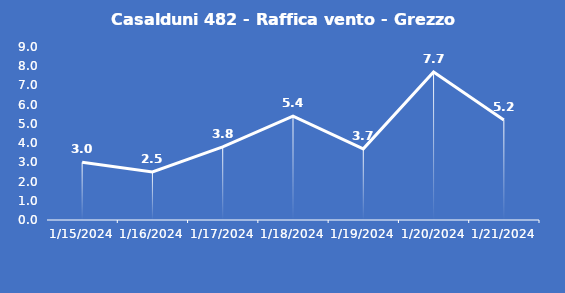
| Category | Casalduni 482 - Raffica vento - Grezzo (m/s) |
|---|---|
| 1/15/24 | 3 |
| 1/16/24 | 2.5 |
| 1/17/24 | 3.8 |
| 1/18/24 | 5.4 |
| 1/19/24 | 3.7 |
| 1/20/24 | 7.7 |
| 1/21/24 | 5.2 |